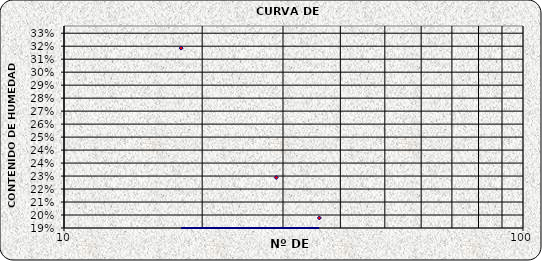
| Category | Series 0 |
|---|---|
| 36.0 | 0.197 |
| 29.0 | 0.225 |
| 18.0 | 0.315 |